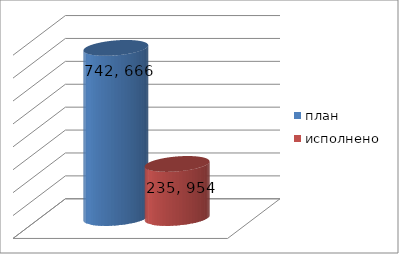
| Category | план | исполнено |
|---|---|---|
| 0 | 742666122.85 | 235954703.04 |